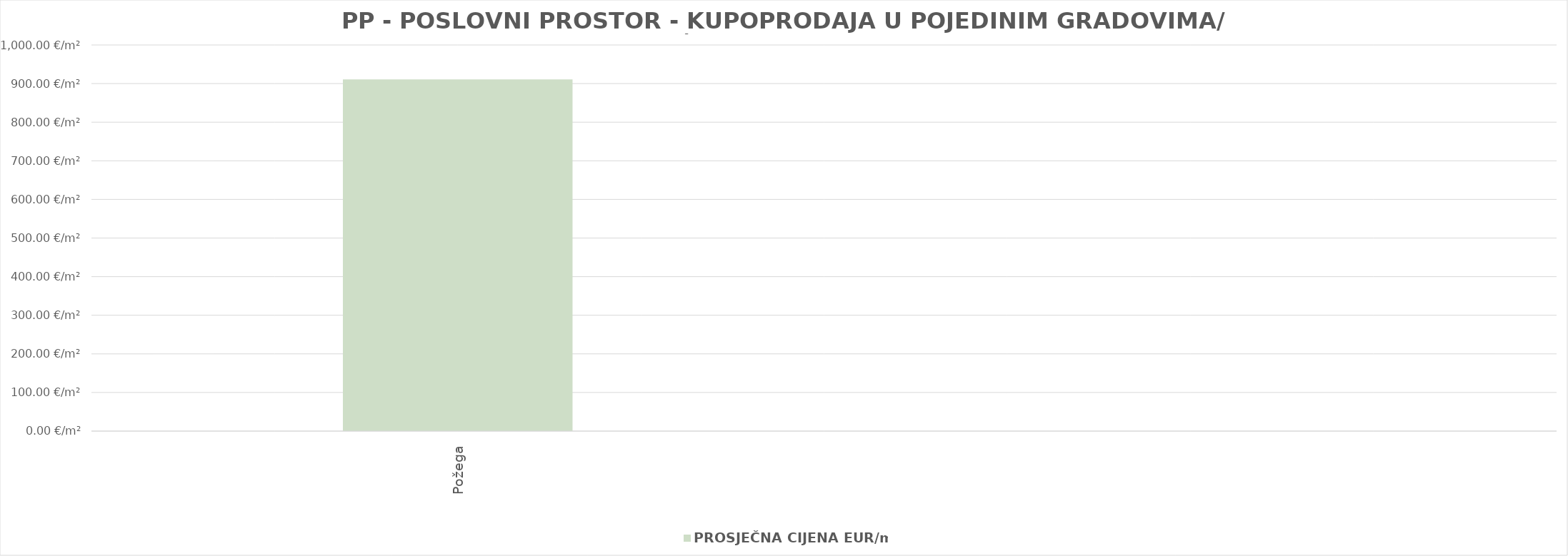
| Category | PROSJEČNA CIJENA EUR/m2 |
|---|---|
| Požega | 1902-06-28 19:16:08 |